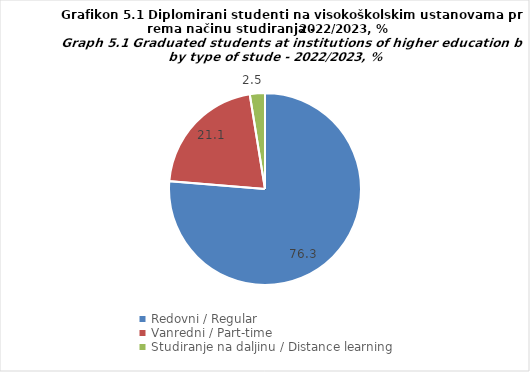
| Category | % |
|---|---|
| Redovni / Regular | 76.306 |
| Vanredni / Part-time | 21.149 |
| Studiranje na daljinu / Distance learning  | 2.545 |